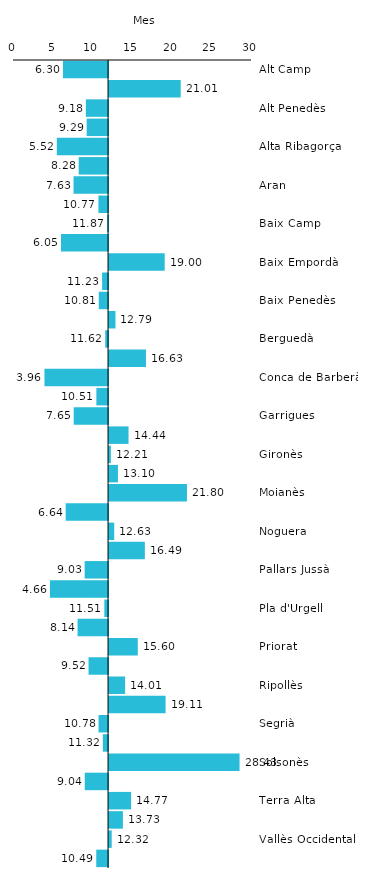
| Category | Series 0 |
|---|---|
| Alt Camp | 6.295 |
| Alt Empordà | 21.012 |
| Alt Penedès | 9.183 |
| Alt Urgell | 9.286 |
| Alta Ribagorça | 5.521 |
| Anoia | 8.28 |
| Aran | 7.628 |
| Bages | 10.769 |
| Baix Camp | 11.872 |
| Baix Ebre | 6.055 |
| Baix Empordà | 18.995 |
| Baix Llobregat | 11.229 |
| Baix Penedès | 10.809 |
| Barcelonès | 12.788 |
| Berguedà | 11.62 |
| Cerdanya | 16.633 |
| Conca de Barberà | 3.964 |
| Garraf | 10.508 |
| Garrigues | 7.652 |
| Garrotxa | 14.438 |
| Gironès | 12.208 |
| Maresme | 13.103 |
| Moianès | 21.801 |
| Montsià | 6.639 |
| Noguera | 12.634 |
| Osona | 16.495 |
| Pallars Jussà | 9.032 |
| Pallars Sobirà | 4.656 |
| Pla d'Urgell | 11.514 |
| Pla de l'Estany | 8.138 |
| Priorat | 15.603 |
| Ribera d'Ebre | 9.524 |
| Ripollès | 14.009 |
| Segarra | 19.108 |
| Segrià | 10.781 |
| Selva | 11.323 |
| Solsonès | 28.431 |
| Tarragonès | 9.043 |
| Terra Alta | 14.765 |
| Urgell | 13.725 |
| Vallès Occidental | 12.316 |
| Vallès Oriental | 10.494 |